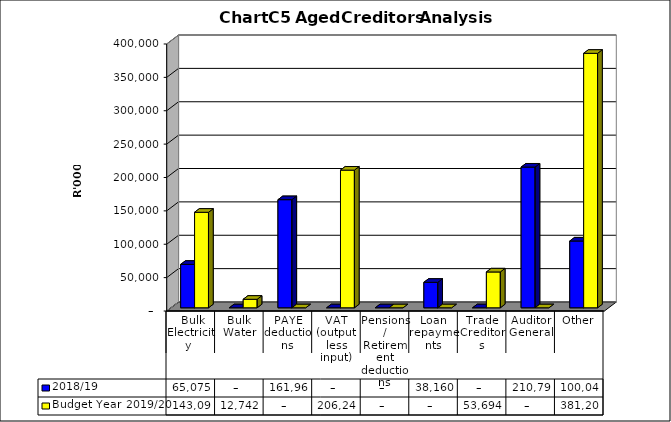
| Category | 2018/19 | Budget Year 2019/20 |
|---|---|---|
|  Bulk Electricity  | 65074620 | 143091668.14 |
| Bulk Water | 0 | 12742194.8 |
| PAYE deductions | 161960650.7 | 0 |
| VAT (output less input) | 0 | 206242948.99 |
| Pensions / Retirement deductions | 0 | 0 |
| Loan repayments | 38159694 | 0 |
| Trade Creditors | 0 | 53693961.1 |
| Auditor General | 210797287.9 | 0 |
| Other | 100046570 | 381205971.88 |